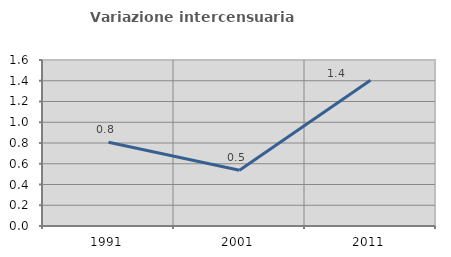
| Category | Variazione intercensuaria annua |
|---|---|
| 1991.0 | 0.808 |
| 2001.0 | 0.538 |
| 2011.0 | 1.404 |